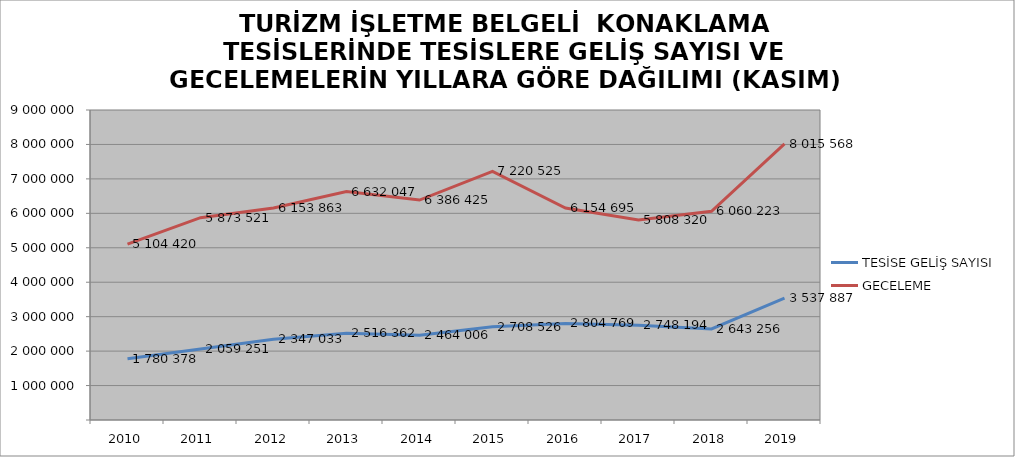
| Category | TESİSE GELİŞ SAYISI | GECELEME |
|---|---|---|
| 2010 | 1780378 | 5104420 |
| 2011 | 2059251 | 5873521 |
| 2012 | 2347033 | 6153863 |
| 2013 | 2516362 | 6632047 |
| 2014 | 2464006 | 6386425 |
| 2015 | 2708526 | 7220525 |
| 2016 | 2804769 | 6154695 |
| 2017 | 2748194 | 5808320 |
| 2018 | 2643256 | 6060223 |
| 2019 | 3537887 | 8015568 |